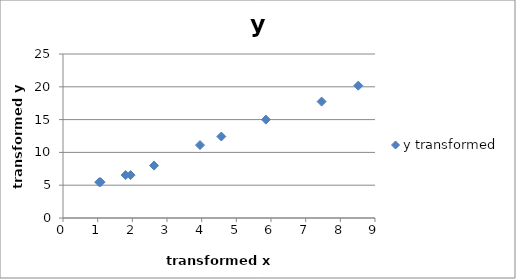
| Category | y transformed |
|---|---|
| 1.9499382828179357 | 6.539 |
| 7.459932029410997 | 17.744 |
| 1.805598053889771 | 6.541 |
| 8.517985361607321 | 20.171 |
| 1.0837518591015998 | 5.465 |
| 5.853784585691642 | 14.997 |
| 3.952008543630895 | 11.118 |
| 4.566973330330322 | 12.42 |
| 2.626991754130744 | 7.989 |
| 1.044156037513153 | 5.463 |